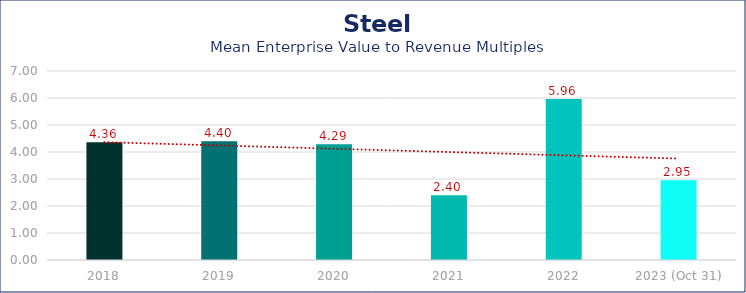
| Category | Steel |
|---|---|
| 2018 | 4.36 |
| 2019 | 4.4 |
| 2020 | 4.29 |
| 2021 | 2.4 |
| 2022 | 5.96 |
| 2023 (Oct 31) | 2.95 |